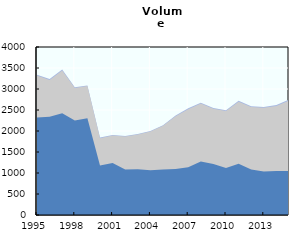
| Category | Marine landings + Aquaculture + Inland fisheries | Marine landings + Aquaculture | Marine landings |
|---|---|---|---|
| 1995.0 | 3339.241 | 3318.891 | 2322.44 |
| 1996.0 | 3236.4 | 3214.01 | 2339.2 |
| 1997.0 | 3462.782 | 3437.918 | 2422.784 |
| 1998.0 | 3044.375 | 3024.373 | 2247.143 |
| 1999.0 | 3083.082 | 3071.553 | 2306.301 |
| 2000.0 | 1842.793 | 1829.35 | 1175.977 |
| 2001.0 | 1905.163 | 1892.993 | 1237.166 |
| 2002.0 | 1879.725 | 1866.904 | 1085.385 |
| 2003.0 | 1931.217 | 1917.617 | 1091.372 |
| 2004.0 | 2000.339 | 1985.342 | 1067.627 |
| 2005.0 | 2138.365 | 2122.026 | 1081.829 |
| 2006.0 | 2371.12 | 2353.416 | 1095.061 |
| 2007.0 | 2540.871 | 2519.914 | 1134.11 |
| 2008.0 | 2670.11 | 2652.028 | 1271.025 |
| 2009.0 | 2547.836 | 2529.472 | 1216.123 |
| 2010.0 | 2495.224 | 2474.498 | 1119.498 |
| 2011.0 | 2720.235 | 2698.248 | 1220.702 |
| 2012.0 | 2587.768 | 2569.857 | 1080.908 |
| 2013.0 | 2569.576 | 2551.34 | 1036.131 |
| 2014.0 | 2617.066 | 2596.305 | 1049.479 |
| 2015.0 | 2747.154 | 2723.233 | 1050.493 |